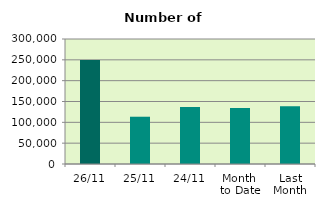
| Category | Series 0 |
|---|---|
| 26/11 | 249696 |
| 25/11 | 113452 |
| 24/11 | 136942 |
| Month 
to Date | 134404.9 |
| Last
Month | 138693.238 |